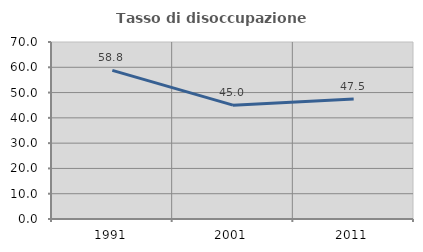
| Category | Tasso di disoccupazione giovanile  |
|---|---|
| 1991.0 | 58.772 |
| 2001.0 | 45.026 |
| 2011.0 | 47.482 |